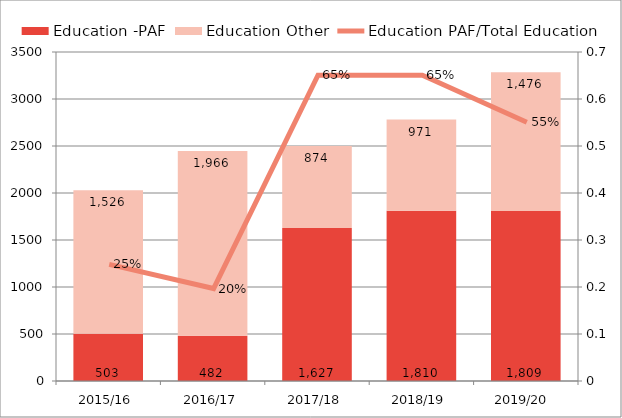
| Category | Education -PAF | Education Other |
|---|---|---|
| 2015/16 | 503.24 | 1525.83 |
| 2016/17 | 481.53 | 1965.93 |
| 2017/18 | 1627.45 | 873.67 |
| 2018/19 | 1809.93 | 971.197 |
| 2019/20  | 1808.65 | 1476.43 |